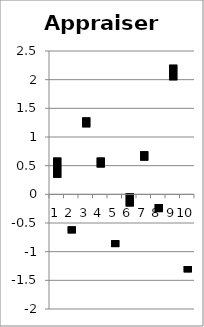
| Category | Series 0 | Series 1 | Series 2 |
|---|---|---|---|
| 0 | 0.29 | 0.41 | 0.64 |
| 1 | -0.56 | -0.68 | -0.58 |
| 2 | 1.34 | 1.17 | 1.27 |
| 3 | 0.47 | 0.5 | 0.64 |
| 4 | -0.8 | -0.92 | -0.84 |
| 5 | 0.02 | -0.11 | -0.21 |
| 6 | 0.59 | 0.75 | 0.66 |
| 7 | -0.31 | -0.2 | -0.17 |
| 8 | 2.26 | 1.99 | 2.01 |
| 9 | -1.36 | -1.25 | -1.31 |